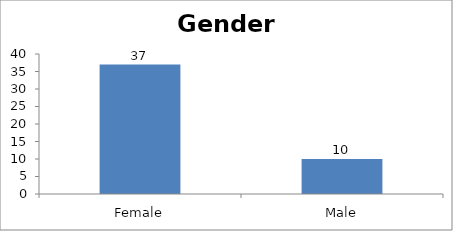
| Category | Gender |
|---|---|
| Female | 37 |
| Male | 10 |